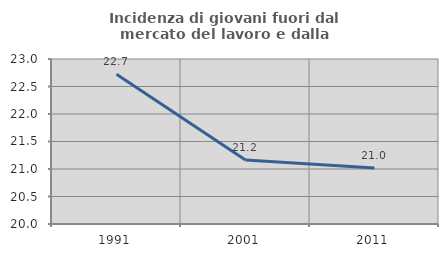
| Category | Incidenza di giovani fuori dal mercato del lavoro e dalla formazione  |
|---|---|
| 1991.0 | 22.723 |
| 2001.0 | 21.163 |
| 2011.0 | 21.018 |